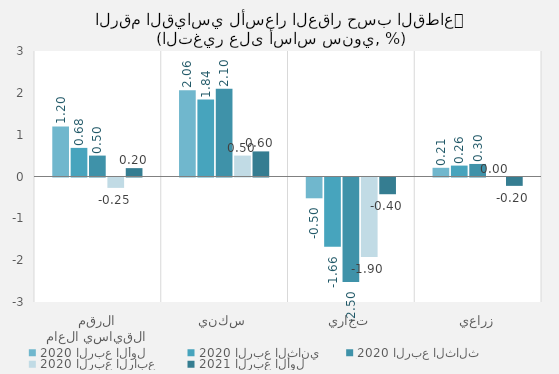
| Category | 2020 | 2021 |
|---|---|---|
| الرقم القياسي العام | -0.248 | 0.2 |
| سكني | 0.5 | 0.6 |
| تجاري | -1.9 | -0.4 |
| زراعي | 0 | -0.2 |